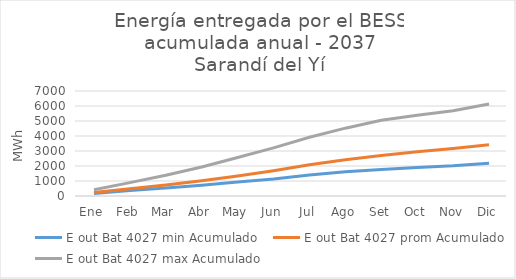
| Category | E out Bat 4027 min Acumulado | E out Bat 4027 prom Acumulado | E out Bat 4027 max Acumulado |
|---|---|---|---|
| Ene | 171 | 237.148 | 418 |
| Feb | 361 | 487.667 | 893 |
| Mar | 532 | 736.074 | 1387 |
| Abr | 722 | 1014.497 | 1938 |
| May | 931 | 1336.793 | 2565 |
| Jun | 1140 | 1681.608 | 3211 |
| Jul | 1406 | 2078.799 | 3914 |
| Ago | 1615 | 2423.614 | 4522 |
| Set | 1767 | 2696.651 | 5054 |
| Oct | 1900 | 2944.354 | 5377 |
| Nov | 2014 | 3161.799 | 5681 |
| Dic | 2185 | 3417.947 | 6137 |